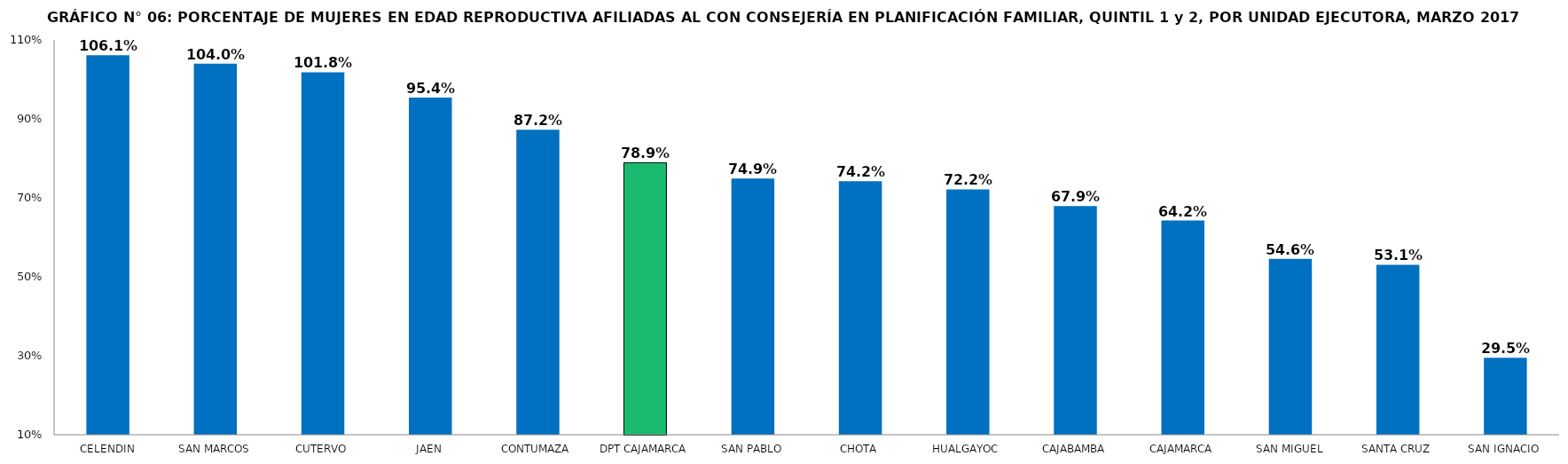
| Category | % AFILIADAS CON CONSEJERÍA EN PPFF 
(QUINTIL 1 y 2) |
|---|---|
| CELENDIN | 1.061 |
| SAN MARCOS | 1.04 |
| CUTERVO | 1.018 |
| JAEN | 0.954 |
| CONTUMAZA | 0.872 |
| DPT CAJAMARCA | 0.789 |
| SAN PABLO | 0.749 |
| CHOTA | 0.742 |
| HUALGAYOC | 0.722 |
| CAJABAMBA | 0.679 |
| CAJAMARCA | 0.642 |
| SAN MIGUEL | 0.546 |
| SANTA CRUZ | 0.531 |
| SAN IGNACIO | 0.295 |